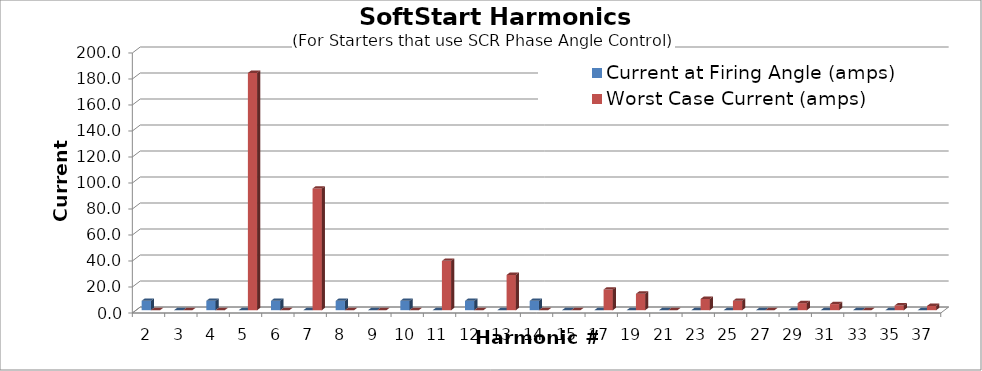
| Category | Current at Firing Angle (amps) | Worst Case Current (amps) |
|---|---|---|
| 2.0 | 7.226 | 0 |
| 3.0 | 0 | 0 |
| 4.0 | 7.226 | 0 |
| 5.0 | 0 | 182.456 |
| 6.0 | 7.226 | 0 |
| 7.0 | 0 | 93.577 |
| 8.0 | 7.226 | 0 |
| 9.0 | 0 | 0 |
| 10.0 | 7.226 | 0 |
| 11.0 | 0 | 37.936 |
| 12.0 | 7.226 | 0 |
| 13.0 | 0 | 27.098 |
| 14.0 | 7.226 | 0 |
| 15.0 | 0 | 0 |
| 17.0 | 0 | 15.897 |
| 19.0 | 0 | 12.646 |
| 21.0 | 0 | 0 |
| 23.0 | 0 | 8.671 |
| 25.0 | 0 | 7.226 |
| 27.0 | 0 | 0 |
| 29.0 | 0 | 5.42 |
| 31.0 | 0 | 4.697 |
| 33.0 | 0 | 0 |
| 35.0 | 0 | 3.613 |
| 37.0 | 0 | 3.252 |